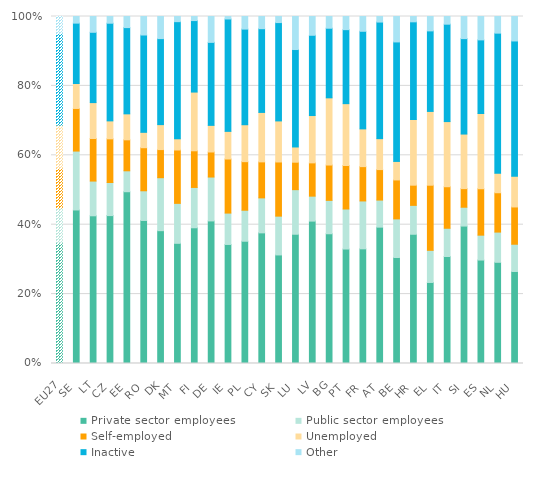
| Category | Private sector employees | Public sector employees | Self-employed | Unemployed | Inactive | Other |
|---|---|---|---|---|---|---|
| EU27 | 0.348 | 0.101 | 0.114 | 0.124 | 0.264 | 0.049 |
| SE | 0.442 | 0.17 | 0.123 | 0.072 | 0.174 | 0.019 |
| LT | 0.426 | 0.1 | 0.123 | 0.104 | 0.203 | 0.045 |
| CZ | 0.426 | 0.095 | 0.126 | 0.052 | 0.281 | 0.019 |
| EE | 0.495 | 0.06 | 0.089 | 0.075 | 0.249 | 0.032 |
| RO | 0.412 | 0.086 | 0.124 | 0.044 | 0.28 | 0.053 |
| DK | 0.383 | 0.153 | 0.081 | 0.072 | 0.248 | 0.064 |
| MT | 0.346 | 0.115 | 0.154 | 0.032 | 0.338 | 0.015 |
| FI | 0.391 | 0.116 | 0.106 | 0.169 | 0.206 | 0.012 |
| DE | 0.411 | 0.126 | 0.072 | 0.077 | 0.239 | 0.075 |
| IE | 0.343 | 0.09 | 0.156 | 0.08 | 0.324 | 0.007 |
| PL | 0.352 | 0.089 | 0.14 | 0.106 | 0.276 | 0.036 |
| CY | 0.376 | 0.101 | 0.104 | 0.143 | 0.241 | 0.035 |
| SK | 0.313 | 0.112 | 0.156 | 0.118 | 0.283 | 0.018 |
| LU | 0.372 | 0.129 | 0.079 | 0.044 | 0.281 | 0.095 |
| LV | 0.41 | 0.072 | 0.096 | 0.136 | 0.231 | 0.054 |
| BG | 0.374 | 0.096 | 0.102 | 0.194 | 0.201 | 0.034 |
| PT | 0.33 | 0.115 | 0.125 | 0.178 | 0.213 | 0.038 |
| FR | 0.33 | 0.138 | 0.099 | 0.109 | 0.281 | 0.043 |
| AT | 0.393 | 0.078 | 0.088 | 0.089 | 0.336 | 0.016 |
| BE | 0.306 | 0.111 | 0.112 | 0.053 | 0.344 | 0.073 |
| HR | 0.372 | 0.083 | 0.058 | 0.189 | 0.282 | 0.015 |
| EL | 0.234 | 0.093 | 0.188 | 0.213 | 0.232 | 0.041 |
| IT | 0.308 | 0.081 | 0.12 | 0.188 | 0.281 | 0.022 |
| SI | 0.396 | 0.054 | 0.054 | 0.157 | 0.275 | 0.064 |
| ES | 0.298 | 0.072 | 0.134 | 0.217 | 0.212 | 0.067 |
| NL | 0.292 | 0.087 | 0.113 | 0.056 | 0.404 | 0.048 |
| HU | 0.265 | 0.079 | 0.107 | 0.089 | 0.39 | 0.071 |